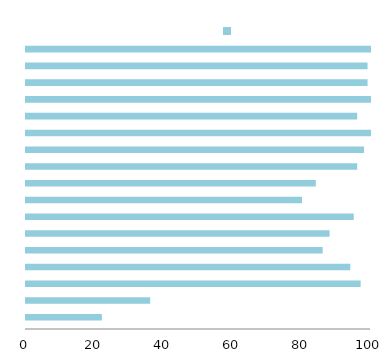
| Category | 2011 | 1990 |
|---|---|---|
| Somalia | 67 | 22 |
| Mauritania | 86 | 36 |
| Iraq | 52 | 97 |
| Morocco | 66 | 94 |
| Sudan | 78 | 86 |
| Yemen | 98 | 88 |
| Tunisia | 100 | 95 |
| Djibouti | 85 | 80 |
| Oman | 96 | 84 |
| Syria | 92 | 96 |
| Comoros | 100 | 98 |
| Palestine | 98 | 100 |
| Egypt | 91 | 96 |
| Algeria | 95 | 100 |
| Jordan | 94 | 99 |
| Kuwait | 96 | 99 |
| Lebanon | 91 | 100 |